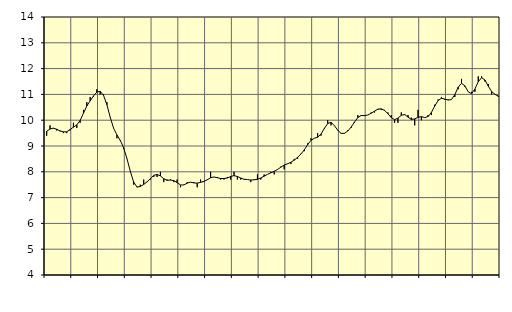
| Category | Piggar | Byggverksamhet, SNI 41-43 |
|---|---|---|
| nan | 9.4 | 9.57 |
| 87.0 | 9.8 | 9.66 |
| 87.0 | 9.7 | 9.69 |
| 87.0 | 9.6 | 9.65 |
| nan | 9.6 | 9.58 |
| 88.0 | 9.5 | 9.55 |
| 88.0 | 9.5 | 9.55 |
| 88.0 | 9.6 | 9.64 |
| nan | 9.9 | 9.73 |
| 89.0 | 9.7 | 9.82 |
| 89.0 | 9.9 | 9.99 |
| 89.0 | 10.4 | 10.27 |
| nan | 10.7 | 10.55 |
| 90.0 | 10.9 | 10.75 |
| 90.0 | 10.9 | 10.94 |
| 90.0 | 11.2 | 11.09 |
| nan | 11 | 11.12 |
| 91.0 | 11 | 10.96 |
| 91.0 | 10.7 | 10.6 |
| 91.0 | 10.1 | 10.11 |
| nan | 9.7 | 9.69 |
| 92.0 | 9.3 | 9.43 |
| 92.0 | 9.2 | 9.22 |
| 92.0 | 8.9 | 8.93 |
| nan | 8.5 | 8.51 |
| 93.0 | 8 | 8.02 |
| 93.0 | 7.5 | 7.6 |
| 93.0 | 7.4 | 7.41 |
| nan | 7.5 | 7.43 |
| 94.0 | 7.7 | 7.51 |
| 94.0 | 7.6 | 7.61 |
| 94.0 | 7.7 | 7.73 |
| nan | 7.8 | 7.86 |
| 95.0 | 7.8 | 7.9 |
| 95.0 | 8 | 7.84 |
| 95.0 | 7.6 | 7.73 |
| nan | 7.7 | 7.67 |
| 96.0 | 7.7 | 7.68 |
| 96.0 | 7.6 | 7.66 |
| 96.0 | 7.7 | 7.58 |
| nan | 7.4 | 7.49 |
| 97.0 | 7.5 | 7.49 |
| 97.0 | 7.6 | 7.56 |
| 97.0 | 7.6 | 7.6 |
| nan | 7.6 | 7.57 |
| 98.0 | 7.4 | 7.56 |
| 98.0 | 7.7 | 7.59 |
| 98.0 | 7.6 | 7.63 |
| nan | 7.7 | 7.69 |
| 99.0 | 8 | 7.77 |
| 99.0 | 7.8 | 7.8 |
| 99.0 | 7.8 | 7.77 |
| nan | 7.7 | 7.74 |
| 0.0 | 7.7 | 7.74 |
| 0.0 | 7.8 | 7.76 |
| 0.0 | 7.7 | 7.82 |
| nan | 8 | 7.85 |
| 1.0 | 7.7 | 7.82 |
| 1.0 | 7.7 | 7.76 |
| 1.0 | 7.7 | 7.71 |
| nan | 7.7 | 7.7 |
| 2.0 | 7.6 | 7.68 |
| 2.0 | 7.7 | 7.69 |
| 2.0 | 7.9 | 7.71 |
| nan | 7.7 | 7.76 |
| 3.0 | 7.9 | 7.83 |
| 3.0 | 7.9 | 7.9 |
| 3.0 | 8 | 7.96 |
| nan | 7.9 | 8.02 |
| 4.0 | 8.1 | 8.09 |
| 4.0 | 8.2 | 8.18 |
| 4.0 | 8.1 | 8.26 |
| nan | 8.3 | 8.31 |
| 5.0 | 8.3 | 8.37 |
| 5.0 | 8.5 | 8.45 |
| 5.0 | 8.5 | 8.56 |
| nan | 8.7 | 8.69 |
| 6.0 | 8.8 | 8.85 |
| 6.0 | 9.1 | 9.05 |
| 6.0 | 9.3 | 9.22 |
| nan | 9.3 | 9.3 |
| 7.0 | 9.5 | 9.34 |
| 7.0 | 9.4 | 9.46 |
| 7.0 | 9.7 | 9.68 |
| nan | 10 | 9.87 |
| 8.0 | 9.8 | 9.92 |
| 8.0 | 9.8 | 9.79 |
| 8.0 | 9.6 | 9.61 |
| nan | 9.5 | 9.49 |
| 9.0 | 9.5 | 9.49 |
| 9.0 | 9.6 | 9.58 |
| 9.0 | 9.7 | 9.73 |
| nan | 9.9 | 9.93 |
| 10.0 | 10.2 | 10.1 |
| 10.0 | 10.2 | 10.18 |
| 10.0 | 10.2 | 10.18 |
| nan | 10.2 | 10.2 |
| 11.0 | 10.3 | 10.27 |
| 11.0 | 10.3 | 10.35 |
| 11.0 | 10.4 | 10.43 |
| nan | 10.4 | 10.44 |
| 12.0 | 10.4 | 10.38 |
| 12.0 | 10.3 | 10.25 |
| 12.0 | 10.2 | 10.1 |
| nan | 9.9 | 10.02 |
| 13.0 | 9.9 | 10.08 |
| 13.0 | 10.3 | 10.19 |
| 13.0 | 10.2 | 10.22 |
| nan | 10.2 | 10.12 |
| 14.0 | 10.1 | 10.03 |
| 14.0 | 9.8 | 10.05 |
| 14.0 | 10.4 | 10.11 |
| nan | 10 | 10.14 |
| 15.0 | 10.1 | 10.1 |
| 15.0 | 10.2 | 10.14 |
| 15.0 | 10.2 | 10.3 |
| nan | 10.6 | 10.55 |
| 16.0 | 10.8 | 10.76 |
| 16.0 | 10.9 | 10.85 |
| 16.0 | 10.8 | 10.82 |
| nan | 10.8 | 10.78 |
| 17.0 | 10.8 | 10.8 |
| 17.0 | 10.9 | 10.99 |
| 17.0 | 11.2 | 11.28 |
| nan | 11.6 | 11.43 |
| 18.0 | 11.3 | 11.33 |
| 18.0 | 11.1 | 11.1 |
| 18.0 | 11.1 | 11.03 |
| nan | 11.1 | 11.21 |
| 19.0 | 11.7 | 11.49 |
| 19.0 | 11.7 | 11.65 |
| 19.0 | 11.5 | 11.56 |
| nan | 11.4 | 11.32 |
| 20.0 | 11 | 11.11 |
| 20.0 | 11 | 11 |
| 20.0 | 10.9 | 10.94 |